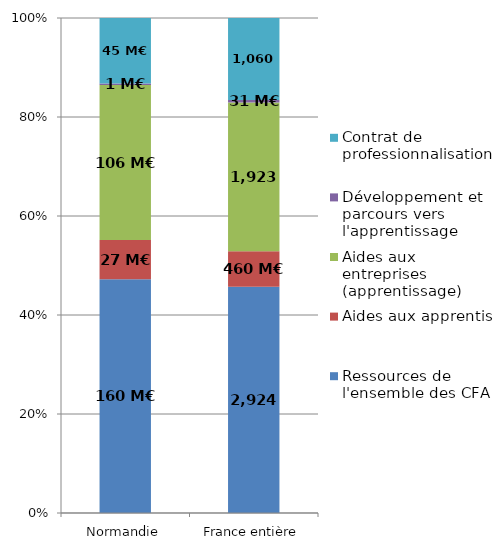
| Category | Ressources de l'ensemble des CFA | Aides aux apprentis | Aides aux entreprises (apprentissage) | Développement et parcours vers l'apprentissage | Contrat de professionnalisation |
|---|---|---|---|---|---|
| Normandie | 160.047 | 26.972 | 106.128 | 1.114 | 44.814 |
| France entière | 2924.219 | 459.796 | 1923.184 | 31.421 | 1060.48 |